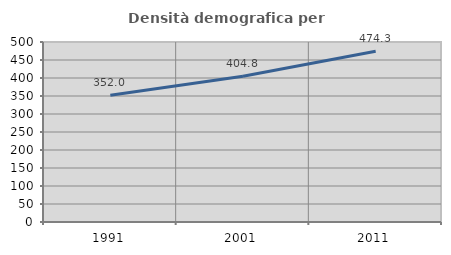
| Category | Densità demografica |
|---|---|
| 1991.0 | 352.017 |
| 2001.0 | 404.83 |
| 2011.0 | 474.254 |